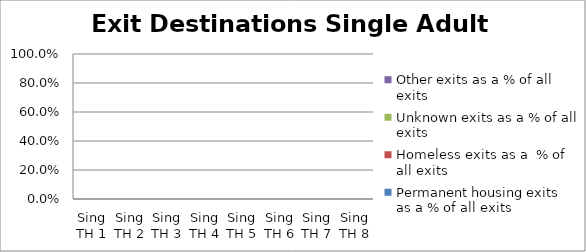
| Category | Permanent housing exits as a % of all exits | Homeless exits as a  % of all exits | Unknown exits as a % of all exits | Other exits as a % of all exits |
|---|---|---|---|---|
| Sing TH 1 | 0 | 0 | 0 | 0 |
| Sing TH 2 | 0 | 0 | 0 | 0 |
| Sing TH 3 | 0 | 0 | 0 | 0 |
| Sing TH 4 | 0 | 0 | 0 | 0 |
| Sing TH 5 | 0 | 0 | 0 | 0 |
| Sing TH 6 | 0 | 0 | 0 | 0 |
| Sing TH 7 | 0 | 0 | 0 | 0 |
| Sing TH 8 | 0 | 0 | 0 | 0 |